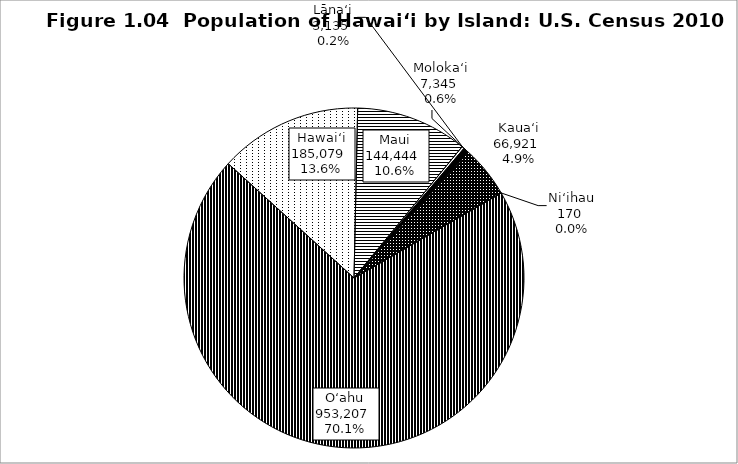
| Category | Series 0 |
|---|---|
| O‘ahu | 953207 |
| Hawai‘i | 185079 |
| Maui | 144444 |
| Lāna‘i | 3135 |
| Moloka‘i | 7345 |
| Kaua‘i | 66921 |
| Ni‘ihau | 170 |